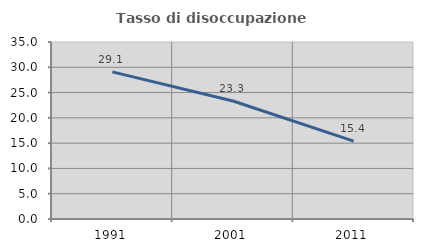
| Category | Tasso di disoccupazione giovanile  |
|---|---|
| 1991.0 | 29.091 |
| 2001.0 | 23.333 |
| 2011.0 | 15.385 |